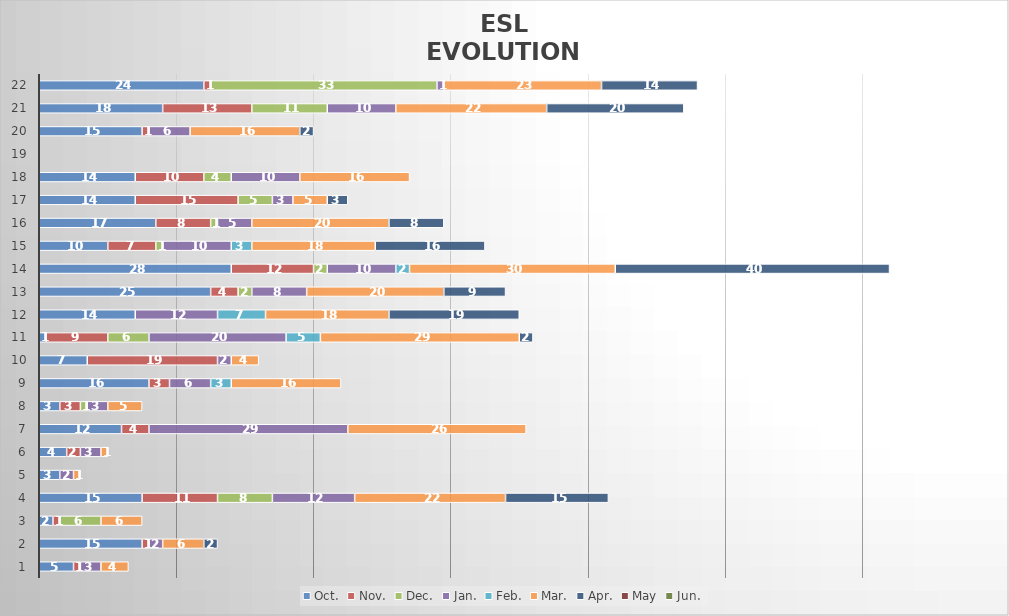
| Category | Oct. | Nov. | Dec. | Jan. | Feb. | Mar. | Apr. | May | Jun. |
|---|---|---|---|---|---|---|---|---|---|
| 1.0 | 5 | 1 | 0 | 3 | 0 | 4 | 0 | 0 | 0 |
| 2.0 | 15 | 1 | 0 | 2 | 0 | 6 | 2 | 0 | 0 |
| 3.0 | 2 | 1 | 6 | 0 | 0 | 6 | 0 | 0 | 0 |
| 4.0 | 15 | 11 | 8 | 12 | 0 | 22 | 15 | 0 | 0 |
| 5.0 | 3 | 0 | 0 | 2 | 0 | 1 | 0 | 0 | 0 |
| 6.0 | 4 | 2 | 0 | 3 | 0 | 1 | 0 | 0 | 0 |
| 7.0 | 12 | 4 | 0 | 29 | 0 | 26 | 0 | 0 | 0 |
| 8.0 | 3 | 3 | 1 | 3 | 0 | 5 | 0 | 0 | 0 |
| 9.0 | 16 | 3 | 0 | 6 | 3 | 16 | 0 | 0 | 0 |
| 10.0 | 7 | 19 | 0 | 2 | 0 | 4 | 0 | 0 | 0 |
| 11.0 | 1 | 9 | 6 | 20 | 5 | 29 | 2 | 0 | 0 |
| 12.0 | 14 | 0 | 0 | 12 | 7 | 18 | 19 | 0 | 0 |
| 13.0 | 25 | 4 | 2 | 8 | 0 | 20 | 9 | 0 | 0 |
| 14.0 | 28 | 12 | 2 | 10 | 2 | 30 | 40 | 0 | 0 |
| 15.0 | 10 | 7 | 1 | 10 | 3 | 18 | 16 | 0 | 0 |
| 16.0 | 17 | 8 | 1 | 5 | 0 | 20 | 8 | 0 | 0 |
| 17.0 | 14 | 15 | 5 | 3 | 0 | 5 | 3 | 0 | 0 |
| 18.0 | 14 | 10 | 4 | 10 | 0 | 16 | 0 | 0 | 0 |
| 19.0 | 0 | 0 | 0 | 0 | 0 | 0 | 0 | 0 | 0 |
| 20.0 | 15 | 1 | 0 | 6 | 0 | 16 | 2 | 0 | 0 |
| 21.0 | 18 | 13 | 11 | 10 | 0 | 22 | 20 | 0 | 0 |
| 22.0 | 24 | 1 | 33 | 1 | 0 | 23 | 14 | 0 | 0 |